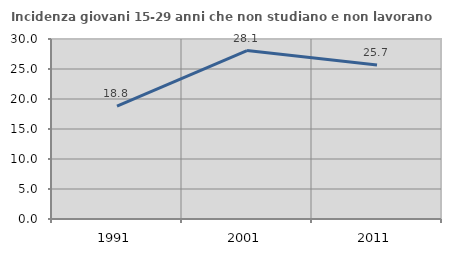
| Category | Incidenza giovani 15-29 anni che non studiano e non lavorano  |
|---|---|
| 1991.0 | 18.828 |
| 2001.0 | 28.075 |
| 2011.0 | 25.653 |